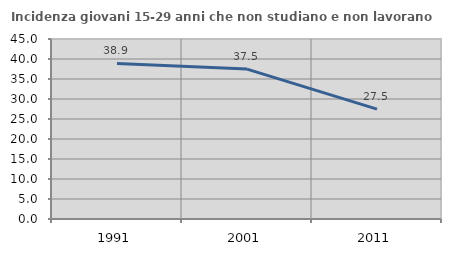
| Category | Incidenza giovani 15-29 anni che non studiano e non lavorano  |
|---|---|
| 1991.0 | 38.896 |
| 2001.0 | 37.471 |
| 2011.0 | 27.461 |